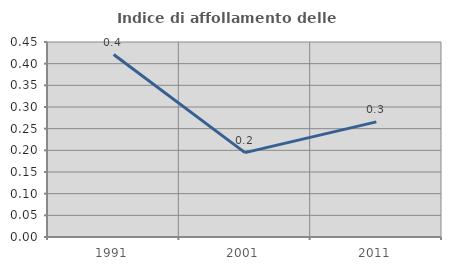
| Category | Indice di affollamento delle abitazioni  |
|---|---|
| 1991.0 | 0.421 |
| 2001.0 | 0.195 |
| 2011.0 | 0.266 |